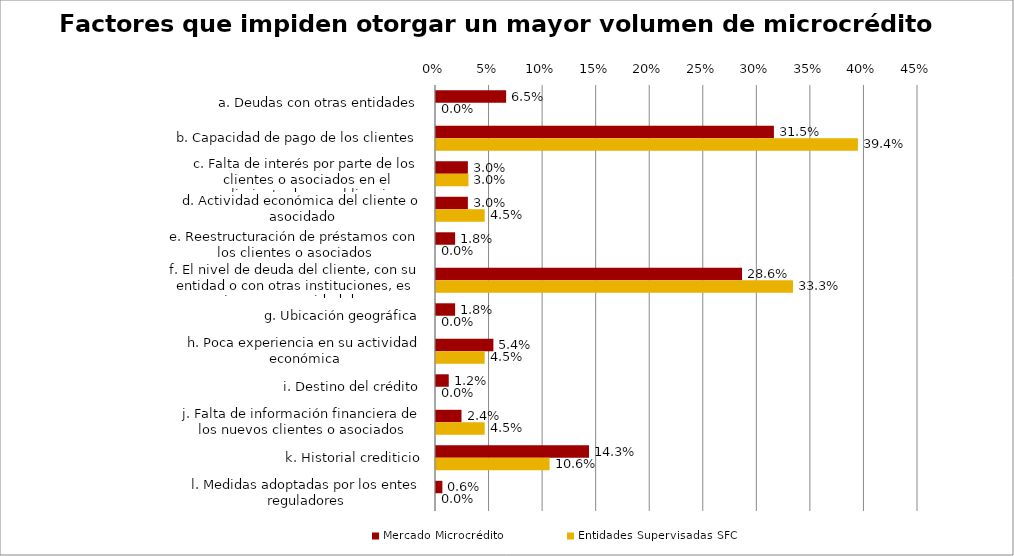
| Category | Mercado Microcrédito | Entidades Supervisadas SFC |
|---|---|---|
| a. Deudas con otras entidades | 0.065 | 0 |
| b. Capacidad de pago de los clientes | 0.315 | 0.394 |
| c. Falta de interés por parte de los clientes o asociados en el cumplimiento de sus obligaciones | 0.03 | 0.03 |
| d. Actividad económica del cliente o asocidado | 0.03 | 0.045 |
| e. Reestructuración de préstamos con los clientes o asociados | 0.018 | 0 |
| f. El nivel de deuda del cliente, con su entidad o con otras instituciones, es superior a su capacidad de pago (sobrendeudamiento) | 0.286 | 0.333 |
| g. Ubicación geográfica | 0.018 | 0 |
| h. Poca experiencia en su actividad económica | 0.054 | 0.045 |
| i. Destino del crédito | 0.012 | 0 |
| j. Falta de información financiera de los nuevos clientes o asociados | 0.024 | 0.045 |
| k. Historial crediticio | 0.143 | 0.106 |
| l. Medidas adoptadas por los entes reguladores | 0.006 | 0 |